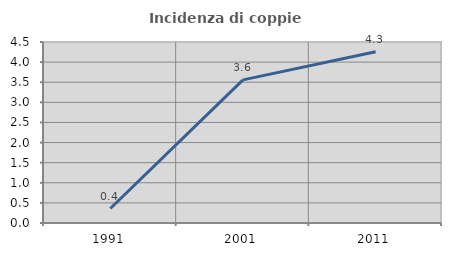
| Category | Incidenza di coppie miste |
|---|---|
| 1991.0 | 0.36 |
| 2001.0 | 3.559 |
| 2011.0 | 4.255 |